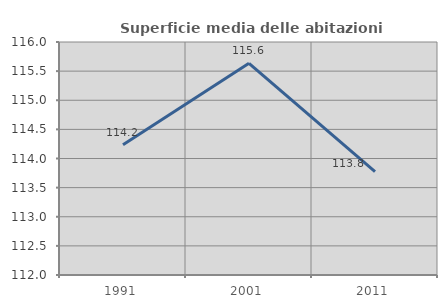
| Category | Superficie media delle abitazioni occupate |
|---|---|
| 1991.0 | 114.236 |
| 2001.0 | 115.634 |
| 2011.0 | 113.774 |